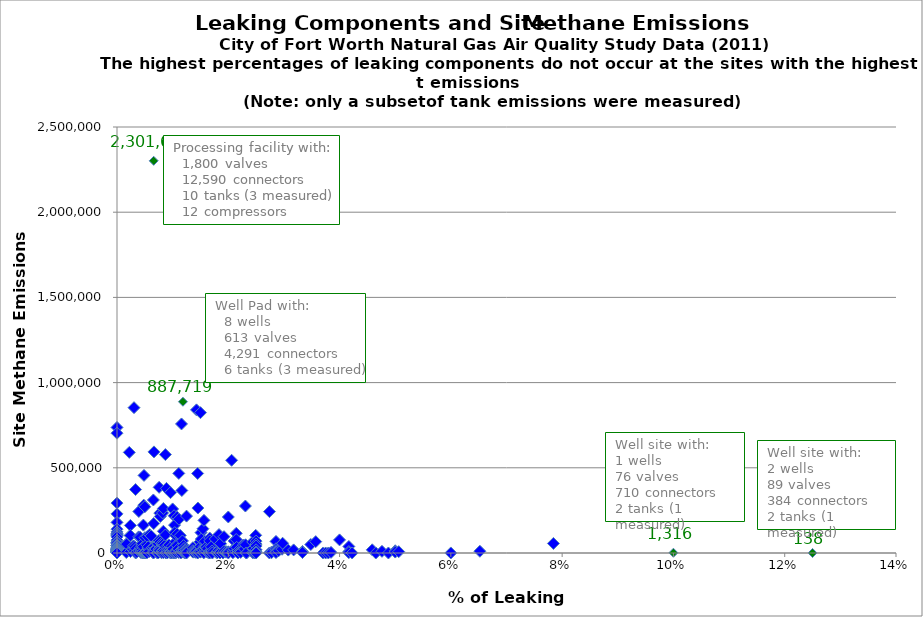
| Category | Methane Emissions [lb/yr] |
|---|---|
| 0.0 | 736640.072 |
| 0.0 | 703041.263 |
| 0.0 | 292983.343 |
| 0.0 | 229634.72 |
| 0.0 | 179505.83 |
| 0.0 | 139754.313 |
| 0.0 | 123635.69 |
| 0.0 | 114181.616 |
| 0.0 | 109098.652 |
| 0.0 | 102866.802 |
| 0.0 | 94723.328 |
| 0.0 | 75810.856 |
| 0.0 | 63353.742 |
| 0.0 | 61981.538 |
| 0.0 | 56633.872 |
| 0.0 | 45966.436 |
| 0.0 | 45801.44 |
| 0.0 | 45645.947 |
| 0.0 | 42914.109 |
| 0.0 | 41017.387 |
| 0.0 | 40832.532 |
| 0.0 | 33274.92 |
| 0.0 | 28386.525 |
| 0.0 | 26202.799 |
| 0.0 | 26054.927 |
| 0.0 | 23385.519 |
| 0.0 | 23037.288 |
| 0.0 | 22662.914 |
| 0.0 | 22239.598 |
| 0.0 | 22135.803 |
| 0.0 | 22104.289 |
| 0.0 | 21524.924 |
| 0.0 | 19544.945 |
| 0.0 | 19054.576 |
| 0.0 | 18553.438 |
| 0.0 | 16436.455 |
| 0.0 | 15417.174 |
| 0.0 | 14359.418 |
| 0.0 | 13533.156 |
| 0.0 | 13410.137 |
| 0.0 | 12871.844 |
| 0.0 | 11172.567 |
| 0.0 | 10902.038 |
| 0.0 | 10621.517 |
| 0.0 | 10491.368 |
| 0.0 | 10309.951 |
| 0.0 | 10049.558 |
| 0.0 | 9157.791 |
| 0.0 | 8673.234 |
| 0.0 | 8536.527 |
| 0.0 | 6864.152 |
| 0.0 | 6609.685 |
| 0.0 | 6018.22 |
| 0.0 | 5278.527 |
| 0.0 | 4893.196 |
| 0.0 | 3665.266 |
| 0.0 | 2705.478 |
| 0.0 | 2333.96 |
| 0.0 | 577.536 |
| 0.0 | 393.234 |
| 0.0 | 23.424 |
| 0.0 | 6.704 |
| 0.0 | 0 |
| 0.0 | 0 |
| 0.0 | 0 |
| 0.0 | 0 |
| 0.0 | 0 |
| 0.0 | 0 |
| 0.0 | 0 |
| 0.0 | 0 |
| 0.0 | 0 |
| 0.0 | 0 |
| 0.0 | 0 |
| 0.0 | 0 |
| 0.0 | 0 |
| 0.0 | 0 |
| 0.0 | 0 |
| 0.0 | 0 |
| 0.0 | 0 |
| 0.0 | 0 |
| 0.0 | 0 |
| 0.0 | 0 |
| 0.0 | 0 |
| 0.0 | 0 |
| 0.0 | 0 |
| 0.0 | 0 |
| 0.0 | 0 |
| 0.0 | 0 |
| 0.0 | 0 |
| 0.0 | 0 |
| 0.0 | 0 |
| 0.0 | 0 |
| 0.0 | 0 |
| 0.0 | 0 |
| 0.0 | 0 |
| 0.0 | 0 |
| 0.0 | 0 |
| 0.0 | 0 |
| 0.0 | 0 |
| 0.0 | 0 |
| 0.0 | 0 |
| 0.0 | 0 |
| 0.0 | 0 |
| 0.0016129032258064516 | 50602.42 |
| 0.0016666666666666668 | 2916.954 |
| 0.0017421602787456446 | 52504.225 |
| 0.0022123893805309734 | 590444.568 |
| 0.002355712603062426 | 102909.04 |
| 0.002403846153846154 | 161693.108 |
| 0.0024096385542168677 | 102735.663 |
| 0.002421307506053269 | 8616.369 |
| 0.0027397260273972603 | 22764.822 |
| 0.002857142857142857 | 19404.399 |
| 0.0029585798816568047 | 41893.37 |
| 0.0030581039755351682 | 852797.005 |
| 0.003115264797507788 | 11346.112 |
| 0.003205128205128205 | 36404.377 |
| 0.0033333333333333335 | 372413.843 |
| 0.003367003367003367 | 20.47 |
| 0.003424657534246575 | 25508.499 |
| 0.0035398230088495575 | 4851.813 |
| 0.003898635477582846 | 94753.559 |
| 0.00392156862745098 | 243713.895 |
| 0.004 | 11529.075 |
| 0.004166666666666667 | 92111.707 |
| 0.004246284501061571 | 30638.479 |
| 0.004329004329004329 | 2182.188 |
| 0.004347826086956522 | 11099.519 |
| 0.004415011037527594 | 24252.277 |
| 0.0044444444444444444 | 46976.035 |
| 0.004545454545454545 | 19822.307 |
| 0.004545454545454545 | 2877.896 |
| 0.0045662100456621 | 54802.892 |
| 0.004629629629629629 | 654.12 |
| 0.004694835680751174 | 9211.38 |
| 0.004728132387706856 | 36625.325 |
| 0.004739336492890996 | 163757.023 |
| 0.004807692307692308 | 280789.832 |
| 0.0048543689320388345 | 455266.154 |
| 0.0048543689320388345 | 147.251 |
| 0.0049504950495049506 | 3.495 |
| 0.005 | 271262.34 |
| 0.005 | 198.726 |
| 0.005025125628140704 | 89943.796 |
| 0.00510204081632653 | 3374.903 |
| 0.0053475935828877 | 48698.441 |
| 0.005376344086021506 | 635.757 |
| 0.005454545454545455 | 96487.629 |
| 0.005555555555555556 | 29813.867 |
| 0.0056179775280898875 | 36463.116 |
| 0.005780346820809248 | 8304.699 |
| 0.0058823529411764705 | 107708.063 |
| 0.006122448979591836 | 100333.36 |
| 0.00625 | 28390.084 |
| 0.00641025641025641 | 31725.567 |
| 0.0064516129032258064 | 2739.575 |
| 0.006535947712418301 | 311293.283 |
| 0.006578947368421052 | 13.408 |
| 0.006587615283267457 | 38669.812 |
| 0.006596306068601583 | 2301639.915 |
| 0.006600660066006601 | 173090.766 |
| 0.006644518272425249 | 593278.824 |
| 0.006666666666666667 | 37881.637 |
| 0.006944444444444444 | 27536.567 |
| 0.007017543859649123 | 23161.615 |
| 0.007246376811594203 | 55380.889 |
| 0.007246376811594203 | 6.704 |
| 0.007407407407407408 | 54454.418 |
| 0.007407407407407408 | 37.465 |
| 0.007518796992481203 | 72953.699 |
| 0.007518796992481203 | 22568.249 |
| 0.007575757575757576 | 385368.728 |
| 0.007575757575757576 | 12277.945 |
| 0.007633587786259542 | 17174.489 |
| 0.007692307692307693 | 234227.156 |
| 0.007692307692307693 | 14399.946 |
| 0.007722007722007722 | 64349.018 |
| 0.007792207792207792 | 214458.884 |
| 0.007978723404255319 | 2320.205 |
| 0.008 | 2104.062 |
| 0.00808080808080808 | 57406.942 |
| 0.00816326530612245 | 14420.1 |
| 0.00819672131147541 | 235134.466 |
| 0.008333333333333333 | 261261.124 |
| 0.008333333333333333 | 127639.208 |
| 0.008333333333333333 | 54684.788 |
| 0.008333333333333333 | 13673.832 |
| 0.008333333333333333 | 1042.63 |
| 0.008571428571428572 | 45673.998 |
| 0.008695652173913044 | 577551.638 |
| 0.008695652173913044 | 105503.898 |
| 0.008771929824561403 | 315.113 |
| 0.008849557522123894 | 6.704 |
| 0.008888888888888889 | 379131.779 |
| 0.00909090909090909 | 41604.886 |
| 0.00909090909090909 | 16834.886 |
| 0.00909090909090909 | 1583.22 |
| 0.009345794392523364 | 46469.437 |
| 0.009523809523809525 | 19287.564 |
| 0.009523809523809525 | 16064.414 |
| 0.009615384615384616 | 354199.085 |
| 0.009615384615384616 | 8722.78 |
| 0.009615384615384616 | 1067.199 |
| 0.009615384615384616 | 212.03 |
| 0.00967741935483871 | 3197.811 |
| 0.009708737864077669 | 4769.88 |
| 0.009876543209876543 | 38813.019 |
| 0.009900990099009901 | 880.919 |
| 0.01 | 258629.96 |
| 0.01 | 22903.831 |
| 0.010080645161290322 | 22781.317 |
| 0.01020408163265306 | 517.578 |
| 0.010256410256410256 | 218954.01 |
| 0.010256410256410256 | 1760.455 |
| 0.010344827586206896 | 163813.976 |
| 0.010380622837370242 | 119787.961 |
| 0.010526315789473684 | 66190.543 |
| 0.010526315789473684 | 157.844 |
| 0.010582010582010581 | 102000.681 |
| 0.010638297872340425 | 4432.268 |
| 0.010810810810810811 | 210633.018 |
| 0.010810810810810811 | 111978.848 |
| 0.010810810810810811 | 51024.926 |
| 0.010810810810810811 | 44652.949 |
| 0.01098901098901099 | 23825.388 |
| 0.011111111111111112 | 467167.248 |
| 0.011111111111111112 | 2606.51 |
| 0.011131725417439703 | 198339.384 |
| 0.011363636363636364 | 103215.065 |
| 0.011363636363636364 | 12823.552 |
| 0.011494252873563218 | 4383.915 |
| 0.011494252873563218 | 291.991 |
| 0.011594202898550725 | 757261.907 |
| 0.011650485436893204 | 366787.126 |
| 0.011764705882352941 | 70799.809 |
| 0.011764705882352941 | 19739.879 |
| 0.011764705882352941 | 11597.979 |
| 0.011834319526627219 | 5233.137 |
| 0.011857707509881422 | 887718.621 |
| 0.01195219123505976 | 43207.464 |
| 0.012048192771084338 | 26641.444 |
| 0.012096774193548387 | 11172.925 |
| 0.012121212121212121 | 15578.567 |
| 0.012121212121212121 | 1757.005 |
| 0.012345679012345678 | 145.954 |
| 0.0125 | 216503.883 |
| 0.0125 | 19403.607 |
| 0.0125 | 11321.494 |
| 0.0125 | 2632.96 |
| 0.0125 | 124.917 |
| 0.013605442176870748 | 6192.996 |
| 0.013636363636363636 | 30913.539 |
| 0.013636363636363636 | 13450.624 |
| 0.0136986301369863 | 4772.118 |
| 0.014084507042253521 | 10623.45 |
| 0.014084507042253521 | 3941.327 |
| 0.014285714285714285 | 840037.697 |
| 0.014285714285714285 | 12427.236 |
| 0.014285714285714285 | 11000.802 |
| 0.014492753623188406 | 466794.479 |
| 0.014492753623188406 | 697.859 |
| 0.014492753623188406 | 71.282 |
| 0.014545454545454545 | 263888.119 |
| 0.014792899408284023 | 6153.518 |
| 0.014925373134328358 | 65273.222 |
| 0.015 | 823539.5 |
| 0.015 | 36793.504 |
| 0.015 | 4747.084 |
| 0.01509433962264151 | 119702.071 |
| 0.015151515151515152 | 81716.714 |
| 0.015384615384615385 | 21943.615 |
| 0.015384615384615385 | 17796.229 |
| 0.01545253863134658 | 142202.665 |
| 0.015544041450777202 | 1797.975 |
| 0.015625 | 191591.225 |
| 0.015625 | 1636.843 |
| 0.01565217391304348 | 38343.14 |
| 0.015706806282722512 | 30545.764 |
| 0.015706806282722512 | 25032.121 |
| 0.015789473684210527 | 68602.696 |
| 0.01597444089456869 | 29647.384 |
| 0.016042780748663103 | 35528.026 |
| 0.016129032258064516 | 7322.194 |
| 0.016260162601626018 | 24744.096 |
| 0.01639344262295082 | 2014.073 |
| 0.016666666666666666 | 87714.211 |
| 0.016666666666666666 | 71069.819 |
| 0.016666666666666666 | 1753.64 |
| 0.016666666666666666 | 40.783 |
| 0.01694915254237288 | 36000.227 |
| 0.017045454545454544 | 4934.057 |
| 0.017094017094017096 | 11286.691 |
| 0.017142857142857144 | 20.111 |
| 0.017660044150110375 | 82184.208 |
| 0.017857142857142856 | 2465.985 |
| 0.018072289156626505 | 1947.253 |
| 0.01818181818181818 | 13790.888 |
| 0.018333333333333333 | 108473.284 |
| 0.018518518518518517 | 50107.546 |
| 0.018518518518518517 | 9165.788 |
| 0.018518518518518517 | 1505.974 |
| 0.018518518518518517 | 232.211 |
| 0.018604651162790697 | 55960.986 |
| 0.01904761904761905 | 0 |
| 0.019230769230769232 | 95680.012 |
| 0.019230769230769232 | 10405.327 |
| 0.0196078431372549 | 7807.008 |
| 0.0196078431372549 | 5006.538 |
| 0.02 | 211388.943 |
| 0.02 | 7069.176 |
| 0.02 | 8.617 |
| 0.020594965675057208 | 544113.483 |
| 0.020833333333333332 | 12630.701 |
| 0.020833333333333332 | 1083.144 |
| 0.021052631578947368 | 70595.552 |
| 0.021052631578947368 | 25885.104 |
| 0.02142857142857143 | 115786.306 |
| 0.02142857142857143 | 79141.816 |
| 0.02142857142857143 | 8721.201 |
| 0.021505376344086023 | 33279.419 |
| 0.021739130434782608 | 11652.2 |
| 0.021739130434782608 | 156.871 |
| 0.02207505518763797 | 7778.677 |
| 0.022222222222222223 | 3551.194 |
| 0.022727272727272728 | 46890.978 |
| 0.022900763358778626 | 24195.345 |
| 0.023076923076923078 | 275687.342 |
| 0.0231023102310231 | 48308.538 |
| 0.023255813953488372 | 6.704 |
| 0.023255813953488372 | 6.704 |
| 0.024390243902439025 | 64989.463 |
| 0.024390243902439025 | 24307.23 |
| 0.024390243902439025 | 1416.926 |
| 0.024539877300613498 | 26674.689 |
| 0.024691358024691357 | 96.056 |
| 0.024930747922437674 | 103811.247 |
| 0.025 | 69873.079 |
| 0.025 | 52390.011 |
| 0.025 | 41164.7 |
| 0.025 | 18884.838 |
| 0.025 | 6476.86 |
| 0.025 | 1104.658 |
| 0.025 | 67.524 |
| 0.0273972602739726 | 242889.794 |
| 0.0273972602739726 | 2.025 |
| 0.027777777777777776 | 4850.525 |
| 0.027777777777777776 | 2078.776 |
| 0.02857142857142857 | 67743.484 |
| 0.02857142857142857 | 24750.478 |
| 0.02857142857142857 | 14373.88 |
| 0.02857142857142857 | 6547.476 |
| 0.02857142857142857 | 2600.018 |
| 0.029045643153526972 | 13029.643 |
| 0.029661016949152543 | 22189.244 |
| 0.02976190476190476 | 57275.233 |
| 0.03076923076923077 | 17139.876 |
| 0.031746031746031744 | 18189.782 |
| 0.03333333333333333 | 9142.083 |
| 0.03333333333333333 | 2728.435 |
| 0.03482587064676617 | 49724.54 |
| 0.03571428571428571 | 66729.997 |
| 0.037037037037037035 | 39.039 |
| 0.0375 | 20.111 |
| 0.0379746835443038 | 17.623 |
| 0.038461538461538464 | 3693.441 |
| 0.04 | 76925.503 |
| 0.041666666666666664 | 38336.045 |
| 0.041666666666666664 | 8509.332 |
| 0.041666666666666664 | 2124.589 |
| 0.04225352112676056 | 208.787 |
| 0.045871559633027525 | 18829.603 |
| 0.046511627906976744 | 10.919 |
| 0.047619047619047616 | 9972.451 |
| 0.04878048780487805 | 78.687 |
| 0.05 | 13027.117 |
| 0.05 | 5447.709 |
| 0.05063291139240506 | 7732.244 |
| 0.06 | 248.438 |
| 0.06521739130434782 | 10351.131 |
| 0.0784313725490196 | 55952.706 |
| 0.1 | 1315.722 |
| 0.125 | 138.324 |